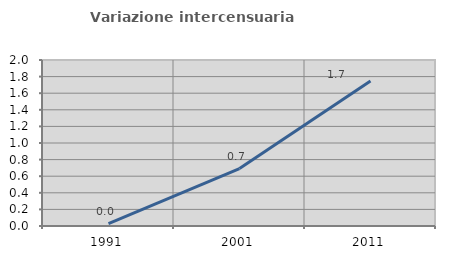
| Category | Variazione intercensuaria annua |
|---|---|
| 1991.0 | 0.03 |
| 2001.0 | 0.692 |
| 2011.0 | 1.746 |